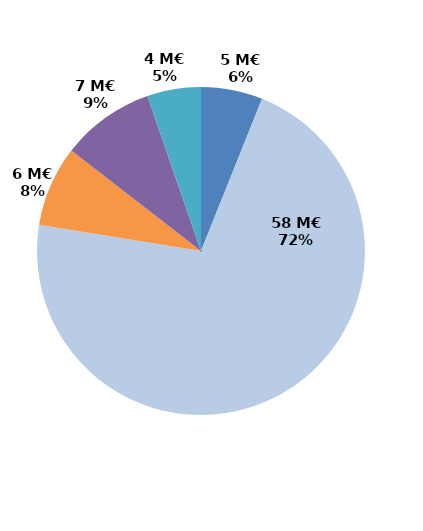
| Category | Series 0 |
|---|---|
| Contrats aidés marchand (hors IAE) | 4.945 |
| Contrats aidés non marchand (hors IAE) | 58.2 |
| Insertion par l'activité économique | 6.466 |
| Mesures en faveur des handicapés | 7.5 |
| Autres emplois aidés | 4.316 |